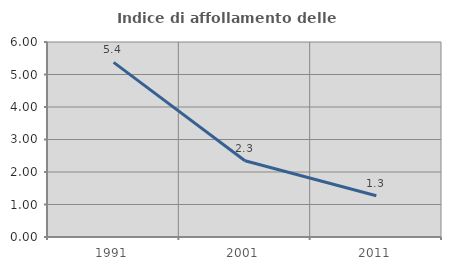
| Category | Indice di affollamento delle abitazioni  |
|---|---|
| 1991.0 | 5.373 |
| 2001.0 | 2.346 |
| 2011.0 | 1.269 |